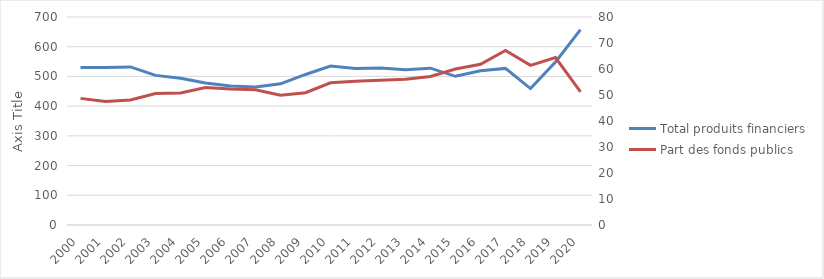
| Category | Total produits financiers |
|---|---|
| 2000.0 | 529.9 |
| 2001.0 | 530.3 |
| 2002.0 | 532 |
| 2003.0 | 503.5 |
| 2004.0 | 493.9 |
| 2005.0 | 478.2 |
| 2006.0 | 467.8 |
| 2007.0 | 464.6 |
| 2008.0 | 475.2 |
| 2009.0 | 506.6 |
| 2010.0 | 535 |
| 2011.0 | 526.3 |
| 2012.0 | 528.1 |
| 2013.0 | 522.8 |
| 2014.0 | 527.7 |
| 2015.0 | 500.4 |
| 2016.0 | 518.9 |
| 2017.0 | 527 |
| 2018.0 | 459.1 |
| 2019.0 | 548.7 |
| 2020.0 | 657.5 |